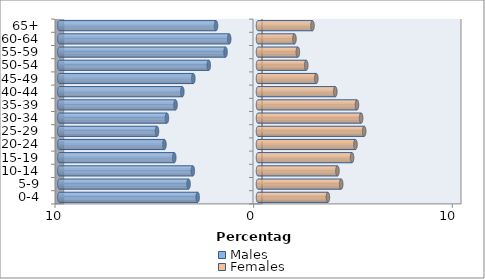
| Category | Males | Females |
|---|---|---|
| 0-4 | -3.036 | 3.519 |
| 5-9 | -3.497 | 4.187 |
| 10-14 | -3.281 | 3.999 |
| 15-19 | -4.216 | 4.735 |
| 20-24 | -4.709 | 4.906 |
| 25-29 | -5.084 | 5.344 |
| 30-34 | -4.585 | 5.191 |
| 35-39 | -4.151 | 4.983 |
| 40-44 | -3.81 | 3.891 |
| 45-49 | -3.256 | 2.936 |
| 50-54 | -2.479 | 2.428 |
| 55-59 | -1.634 | 2.007 |
| 60-64 | -1.448 | 1.835 |
| 65+ | -2.113 | 2.742 |